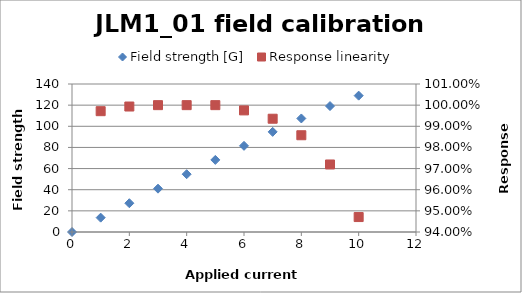
| Category | Field strength [G] |
|---|---|
| 0.0 | 0 |
| 1.0 | 13.58 |
| 2.0 | 27.22 |
| 3.0 | 41 |
| 4.0 | 54.68 |
| 5.0 | 68.19 |
| 6.0 | 81.51 |
| 7.0 | 94.72 |
| 8.0 | 107.4 |
| 9.0 | 119.13 |
| 10.0 | 128.98 |